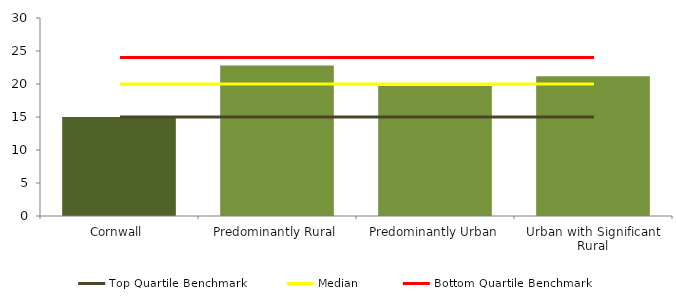
| Category | Series 0 |
|---|---|
| Cornwall | 15 |
| Predominantly Rural | 22.8 |
| Predominantly Urban | 19.694 |
| Urban with Significant Rural | 21.182 |